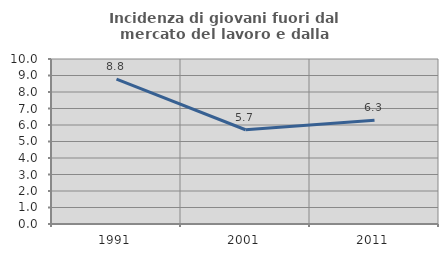
| Category | Incidenza di giovani fuori dal mercato del lavoro e dalla formazione  |
|---|---|
| 1991.0 | 8.783 |
| 2001.0 | 5.711 |
| 2011.0 | 6.289 |